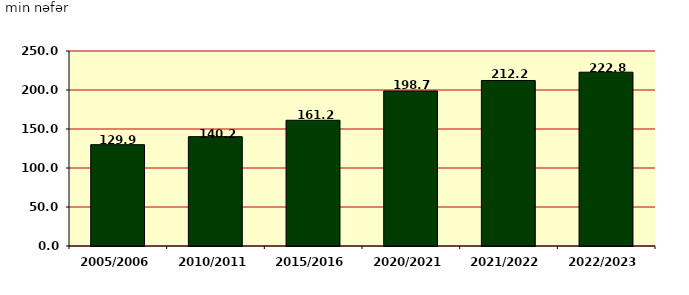
| Category | сцьш, min nцfцr |
|---|---|
| 2005/2006 | 129.9 |
| 2010/2011 | 140.2 |
| 2015/2016 | 161.2 |
| 2020/2021 | 198.7 |
| 2021/2022 | 212.2 |
| 2022/2023 | 222.8 |